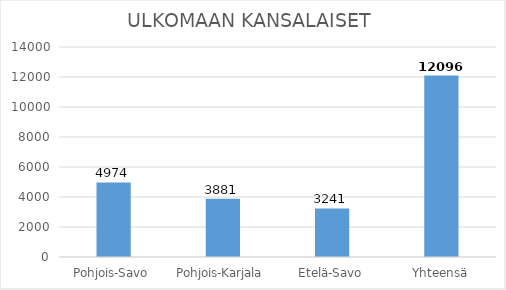
| Category | ULKOMAAN KANSALAISET  |
|---|---|
| Pohjois-Savo | 4974 |
| Pohjois-Karjala | 3881 |
| Etelä-Savo | 3241 |
| Yhteensä | 12096 |